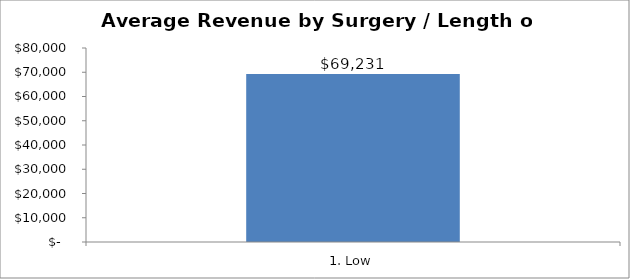
| Category | Total |
|---|---|
| 1. Low | 69230.648 |